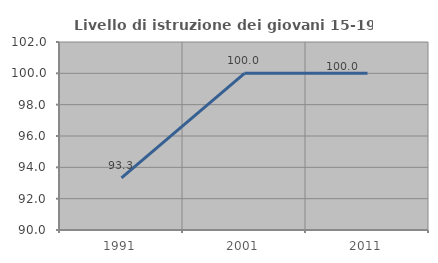
| Category | Livello di istruzione dei giovani 15-19 anni |
|---|---|
| 1991.0 | 93.333 |
| 2001.0 | 100 |
| 2011.0 | 100 |